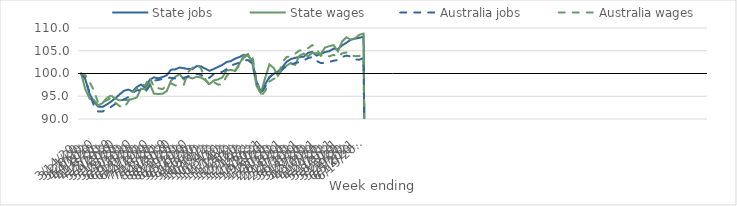
| Category | State jobs | State wages | Australia jobs | Australia wages |
|---|---|---|---|---|
| 14/03/2020 | 100 | 100 | 100 | 100 |
| 21/03/2020 | 98.664 | 96.492 | 98.971 | 99.604 |
| 28/03/2020 | 95.438 | 94.467 | 95.467 | 98.106 |
| 04/04/2020 | 93.778 | 94.151 | 92.922 | 96.239 |
| 11/04/2020 | 92.73 | 93.011 | 91.648 | 93.488 |
| 18/04/2020 | 92.661 | 93.5 | 91.632 | 93.693 |
| 25/04/2020 | 93.189 | 94.65 | 92.163 | 94.114 |
| 02/05/2020 | 93.836 | 95.15 | 92.661 | 94.661 |
| 09/05/2020 | 94.557 | 94.489 | 93.345 | 93.586 |
| 16/05/2020 | 95.416 | 94.1 | 93.938 | 92.82 |
| 23/05/2020 | 96.193 | 94.222 | 94.296 | 92.472 |
| 30/05/2020 | 96.475 | 94.116 | 94.804 | 93.802 |
| 06/06/2020 | 96.084 | 94.42 | 95.79 | 95.983 |
| 13/06/2020 | 97.013 | 94.725 | 96.291 | 96.659 |
| 20/06/2020 | 97.568 | 96.67 | 96.307 | 97.626 |
| 27/06/2020 | 96.812 | 96.516 | 95.924 | 97.398 |
| 04/07/2020 | 98.572 | 97.893 | 97.286 | 99.305 |
| 11/07/2020 | 99.155 | 95.574 | 98.453 | 96.936 |
| 18/07/2020 | 98.937 | 95.496 | 98.574 | 96.771 |
| 25/07/2020 | 99.198 | 95.539 | 98.8 | 96.557 |
| 01/08/2020 | 99.61 | 96.126 | 99.036 | 97.398 |
| 08/08/2020 | 100.829 | 98.407 | 99.039 | 97.865 |
| 15/08/2020 | 100.912 | 99.27 | 98.915 | 97.373 |
| 22/08/2020 | 101.312 | 99.864 | 99.01 | 97.336 |
| 29/08/2020 | 101.154 | 98.696 | 99.05 | 97.544 |
| 05/09/2020 | 100.991 | 99.257 | 99.381 | 100.291 |
| 12/09/2020 | 100.959 | 98.891 | 99.754 | 101.228 |
| 19/09/2020 | 101.632 | 99.287 | 99.918 | 101.971 |
| 26/09/2020 | 101.56 | 99.144 | 99.725 | 101.154 |
| 03/10/2020 | 101.074 | 98.53 | 98.937 | 98.795 |
| 10/10/2020 | 100.586 | 97.669 | 99.064 | 97.403 |
| 17/10/2020 | 100.988 | 98.465 | 99.896 | 98.12 |
| 24/10/2020 | 101.446 | 98.692 | 100.185 | 97.546 |
| 31/10/2020 | 101.887 | 99.135 | 100.363 | 97.615 |
| 07/11/2020 | 102.518 | 100.677 | 100.966 | 99.446 |
| 14/11/2020 | 102.735 | 100.773 | 101.741 | 100.424 |
| 21/11/2020 | 103.267 | 100.598 | 102.085 | 100.522 |
| 28/11/2020 | 103.622 | 102.124 | 102.383 | 101.813 |
| 05/12/2020 | 104.122 | 103.924 | 102.872 | 103.509 |
| 12/12/2020 | 103.902 | 104.265 | 102.957 | 104.014 |
| 19/12/2020 | 102.767 | 102.207 | 102.168 | 103.915 |
| 26/12/2020 | 98.088 | 97.259 | 98.391 | 98.452 |
| 02/01/2021 | 95.958 | 95.7 | 95.58 | 95.006 |
| 09/01/2021 | 97.595 | 99.014 | 96.988 | 96.148 |
| 16/01/2021 | 99.241 | 101.994 | 99.101 | 98.251 |
| 23/01/2021 | 99.925 | 101.21 | 100.068 | 98.817 |
| 30/01/2021 | 100.442 | 99.502 | 100.556 | 99.148 |
| 06/02/2021 | 101.351 | 100.832 | 100.923 | 102.467 |
| 13/02/2021 | 102.565 | 101.707 | 101.643 | 103.619 |
| 20/02/2021 | 103.172 | 102.301 | 101.902 | 103.78 |
| 27/02/2021 | 103.439 | 101.878 | 102.3 | 104.333 |
| 06/03/2021 | 103.644 | 103.884 | 102.521 | 105.064 |
| 13/03/2021 | 103.673 | 104.366 | 102.877 | 105.052 |
| 20/03/2021 | 104.525 | 103.773 | 103.384 | 105.539 |
| 27/03/2021 | 104.737 | 104.5 | 103.612 | 106.245 |
| 03/04/2021 | 103.94 | 104.439 | 102.769 | 105.395 |
| 10/04/2021 | 104.296 | 104.297 | 102.293 | 103.884 |
| 17/04/2021 | 104.706 | 105.701 | 102.308 | 104.211 |
| 24/04/2021 | 104.908 | 106.015 | 102.558 | 103.772 |
| 01/05/2021 | 105.468 | 106.234 | 102.806 | 104.122 |
| 08/05/2021 | 105.324 | 104.874 | 102.974 | 103.594 |
| 15/05/2021 | 106.185 | 107.045 | 103.642 | 104.439 |
| 22/05/2021 | 106.775 | 107.965 | 103.934 | 104.625 |
| 29/05/2021 | 107.415 | 107.445 | 103.744 | 104.038 |
| 05/06/2021 | 107.661 | 107.719 | 103.091 | 103.805 |
| 12/06/2021 | 107.834 | 108.513 | 103.033 | 103.851 |
| 19/06/2021 | 108.121 | 108.77 | 103.366 | 104.254 |